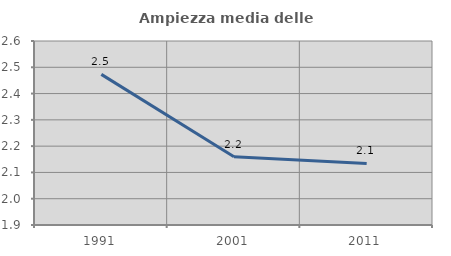
| Category | Ampiezza media delle famiglie |
|---|---|
| 1991.0 | 2.473 |
| 2001.0 | 2.16 |
| 2011.0 | 2.134 |